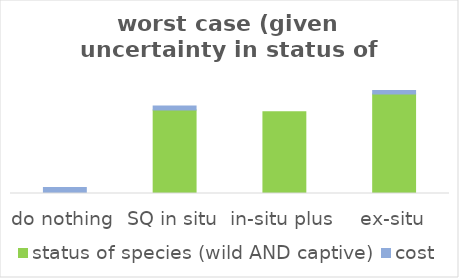
| Category | status of species (wild AND captive) | cost |
|---|---|---|
| do nothing | 0 | 0.02 |
| SQ in situ | 0.276 | 0.013 |
| in-situ plus | 0.27 | 0 |
| ex-situ | 0.329 | 0.011 |